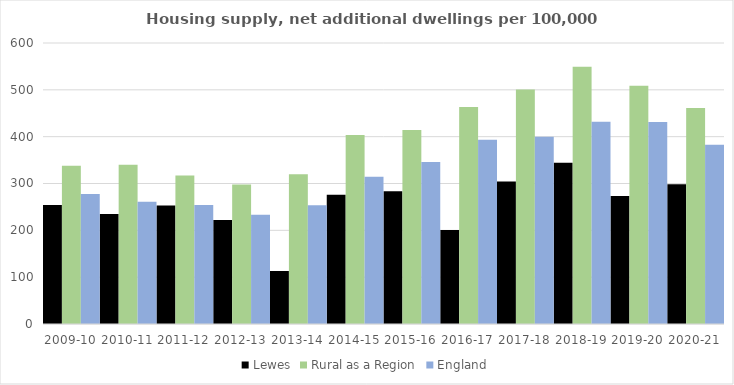
| Category | Lewes | Rural as a Region | England |
|---|---|---|---|
| 2009-10 | 254.073 | 337.852 | 277.548 |
| 2010-11 | 235.066 | 340.105 | 260.994 |
| 2011-12 | 253.115 | 317.04 | 254.007 |
| 2012-13 | 221.896 | 297.763 | 233.153 |
| 2013-14 | 113.424 | 319.835 | 253.602 |
| 2014-15 | 275.819 | 403.796 | 314.256 |
| 2015-16 | 283.455 | 414.091 | 346.154 |
| 2016-17 | 200.726 | 463.209 | 393.256 |
| 2017-18 | 304.136 | 500.68 | 399.646 |
| 2018-19 | 344.546 | 549.491 | 432.099 |
| 2019-20 | 273.076 | 508.493 | 431.187 |
| 2020-21 | 298.479 | 461.114 | 382.827 |